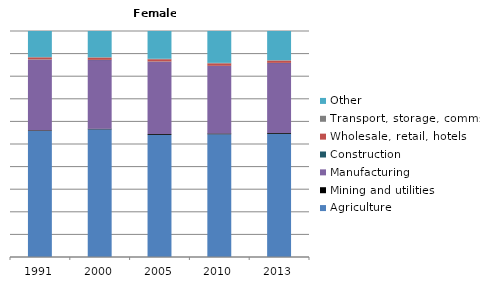
| Category | Agriculture | Mining and utilities | Manufacturing | Construction | Wholesale, retail, hotels | Transport, storage, comms | Other |
|---|---|---|---|---|---|---|---|
| 1991.0 | 55.8 | 0.3 | 31.3 | 0.1 | 0.9 | 0.2 | 11.5 |
| 2000.0 | 56.6 | 0.3 | 30.4 | 0.1 | 1 | 0.2 | 11.6 |
| 2005.0 | 54.1 | 0.4 | 32 | 0.1 | 1 | 0.2 | 12.3 |
| 2010.0 | 54.3 | 0.4 | 29.8 | 0.1 | 1.1 | 0.2 | 14.1 |
| 2013.0 | 54.5 | 0.4 | 30.9 | 0.1 | 1 | 0.2 | 12.9 |